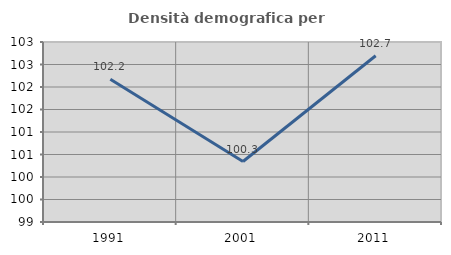
| Category | Densità demografica |
|---|---|
| 1991.0 | 102.173 |
| 2001.0 | 100.344 |
| 2011.0 | 102.695 |